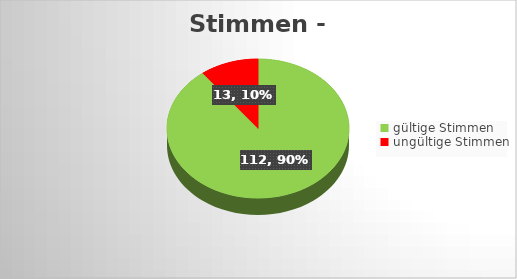
| Category | Series 0 |
|---|---|
| gültige Stimmen | 112 |
| ungültige Stimmen | 13 |